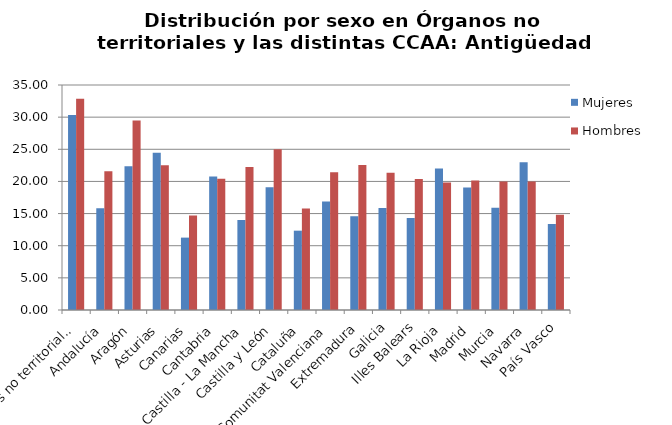
| Category | Mujeres | Hombres |
|---|---|---|
| Órganos no territoriales | 30.34 | 32.87 |
| Andalucía | 15.84 | 21.58 |
| Aragón | 22.36 | 29.48 |
| Asturias | 24.48 | 22.5 |
| Canarias | 11.26 | 14.71 |
| Cantabria | 20.76 | 20.4 |
| Castilla - La Mancha | 14 | 22.23 |
| Castilla y León | 19.1 | 25.02 |
| Cataluña | 12.34 | 15.8 |
| Comunitat Valenciana | 16.88 | 21.44 |
| Extremadura | 14.59 | 22.57 |
| Galicia | 15.85 | 21.35 |
| Illes Balears | 14.32 | 20.38 |
| La Rioja | 22 | 19.83 |
| Madrid | 19.05 | 20.13 |
| Murcia | 15.89 | 20 |
| Navarra | 23 | 20 |
| País Vasco | 13.39 | 14.81 |